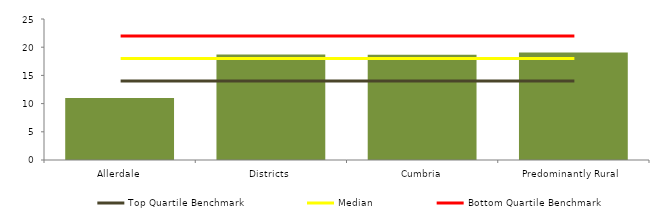
| Category | Block Data |
|---|---|
| Allerdale | 11 |
| Districts | 18.702 |
| Cumbria | 18.667 |
|  Predominantly Rural   | 19.069 |